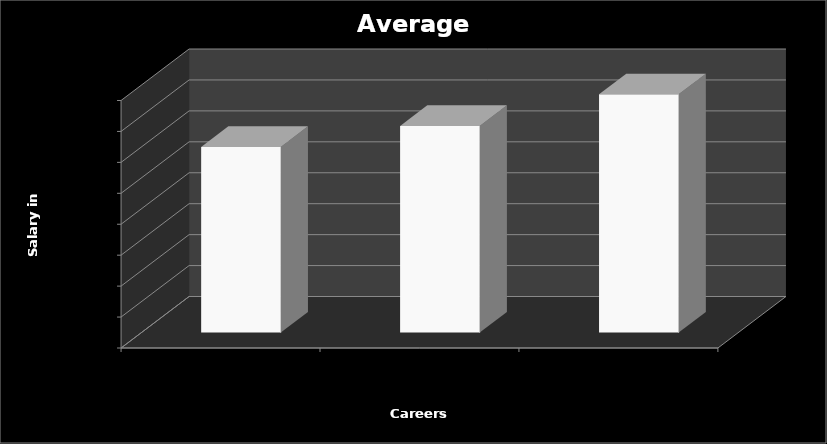
| Category | Series 0 |
|---|---|
| Speech Pathologists | 60000 |
| Occupational Therapists | 66780 |
| Clinical or Counseling Psychologists | 77010 |